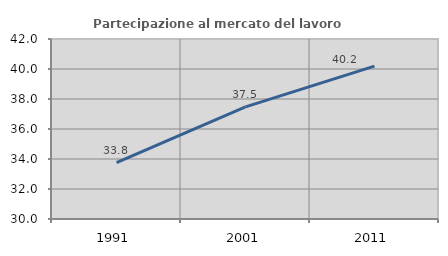
| Category | Partecipazione al mercato del lavoro  femminile |
|---|---|
| 1991.0 | 33.752 |
| 2001.0 | 37.476 |
| 2011.0 | 40.19 |